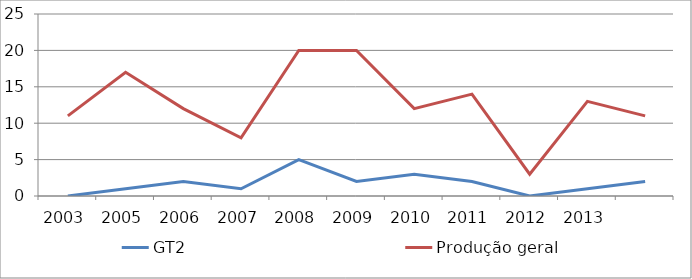
| Category | GT2 | Produção geral |
|---|---|---|
| 2003.0 | 0 | 11 |
| 2005.0 | 1 | 17 |
| 2006.0 | 2 | 12 |
| 2007.0 | 1 | 8 |
| 2008.0 | 5 | 20 |
| 2009.0 | 2 | 20 |
| 2010.0 | 3 | 12 |
| 2011.0 | 2 | 14 |
| 2012.0 | 0 | 3 |
| 2013.0 | 1 | 13 |